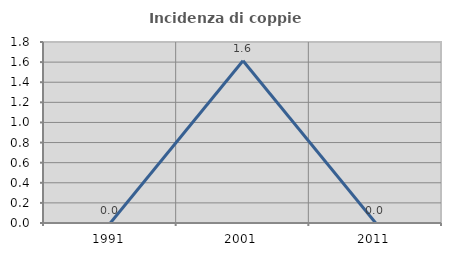
| Category | Incidenza di coppie miste |
|---|---|
| 1991.0 | 0 |
| 2001.0 | 1.613 |
| 2011.0 | 0 |